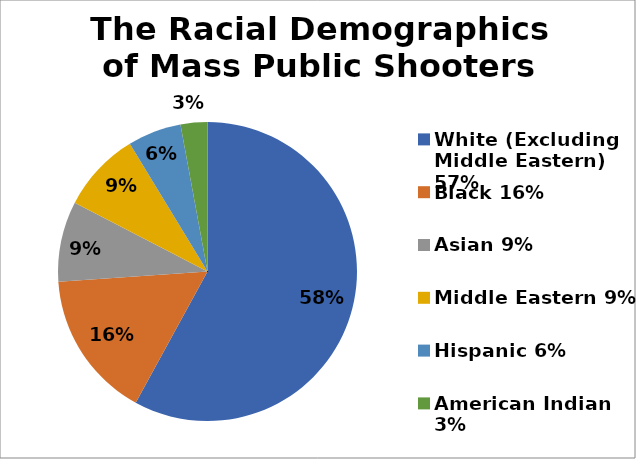
| Category | Series 0 |
|---|---|
| White (Excluding Middle Eastern) 57% | 0.58 |
| Black 16% | 0.159 |
| Asian 9% | 0.087 |
| Middle Eastern 9% | 0.087 |
| Hispanic 6% | 0.058 |
| American Indian 3% | 0.029 |